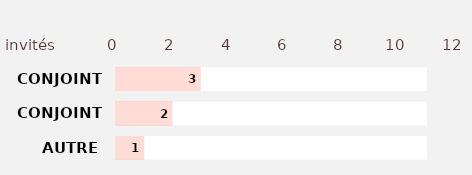
| Category | Series 2 | Series 3 | Series 1 | Series 0 |
|---|---|---|---|---|
| AUTRE | 11 | 1 | 11 | 1 |
| CONJOINT 2 | 11 | 2 | 11 | 2 |
| CONJOINT 1 | 11 | 3 | 11 | 3 |